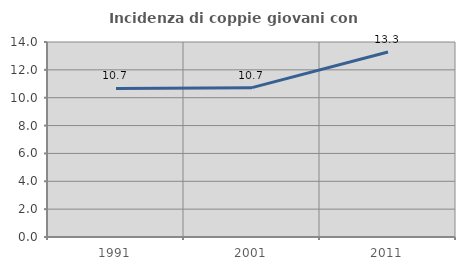
| Category | Incidenza di coppie giovani con figli |
|---|---|
| 1991.0 | 10.664 |
| 2001.0 | 10.723 |
| 2011.0 | 13.281 |